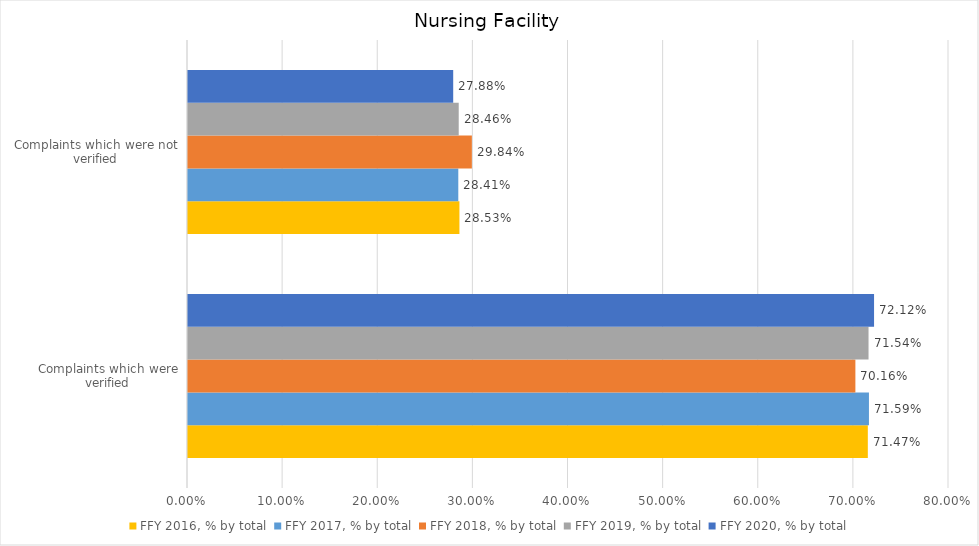
| Category | FFY 2016, % by total | FFY 2017, % by total | FFY 2018, % by total | FFY 2019, % by total | FFY 2020, % by total |
|---|---|---|---|---|---|
| Complaints which were verified | 0.715 | 0.716 | 0.702 | 0.715 | 0.721 |
| Complaints which were not verified | 0.285 | 0.284 | 0.298 | 0.285 | 0.279 |